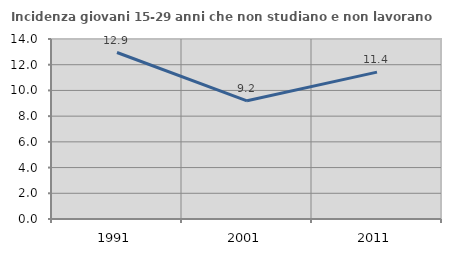
| Category | Incidenza giovani 15-29 anni che non studiano e non lavorano  |
|---|---|
| 1991.0 | 12.949 |
| 2001.0 | 9.19 |
| 2011.0 | 11.425 |